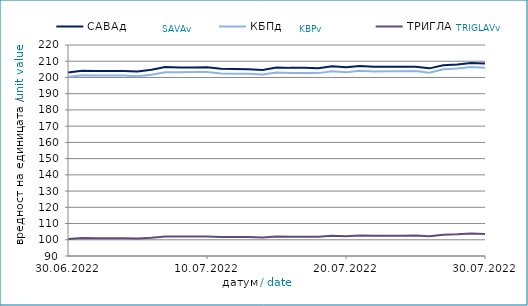
| Category | САВАд | КБПд | ТРИГЛАВд |
|---|---|---|---|
| 2022-06-30 | 203.007 | 200.349 | 100.517 |
| 2022-07-01 | 204.124 | 201.337 | 101.056 |
| 2022-07-02 | 203.961 | 201.165 | 100.965 |
| 2022-07-03 | 203.966 | 201.172 | 100.968 |
| 2022-07-04 | 204.043 | 201.181 | 100.987 |
| 2022-07-05 | 203.733 | 200.729 | 100.765 |
| 2022-07-06 | 204.756 | 201.706 | 101.212 |
| 2022-07-07 | 206.417 | 203.275 | 102 |
| 2022-07-08 | 206.143 | 203.211 | 102.021 |
| 2022-07-09 | 206.21 | 203.291 | 102.065 |
| 2022-07-10 | 206.216 | 203.298 | 102.068 |
| 2022-07-11 | 205.376 | 202.493 | 101.725 |
| 2022-07-12 | 205.258 | 202.338 | 101.682 |
| 2022-07-13 | 205.132 | 202.334 | 101.694 |
| 2022-07-14 | 204.665 | 201.781 | 101.397 |
| 2022-07-15 | 206.167 | 203.096 | 102.071 |
| 2022-07-16 | 205.907 | 202.803 | 101.924 |
| 2022-07-17 | 205.912 | 202.809 | 101.926 |
| 2022-07-18 | 205.72 | 202.675 | 101.867 |
| 2022-07-19 | 206.894 | 203.793 | 102.409 |
| 2022-07-20 | 206.316 | 203.249 | 102.207 |
| 2022-07-21 | 207.102 | 204.174 | 102.595 |
| 2022-07-22 | 206.582 | 203.737 | 102.42 |
| 2022-07-23 | 206.654 | 203.794 | 102.447 |
| 2022-07-24 | 206.66 | 203.801 | 102.45 |
| 2022-07-25 | 206.588 | 203.926 | 102.554 |
| 2022-07-26 | 205.607 | 202.964 | 102.12 |
| 2022-07-27 | 207.456 | 205.009 | 103.064 |
| 2022-07-28 | 207.976 | 205.5 | 103.34 |
| 2022-07-29 | 208.918 | 206.427 | 103.836 |
| 2022-07-30 | 208.532 | 205.985 | 103.628 |